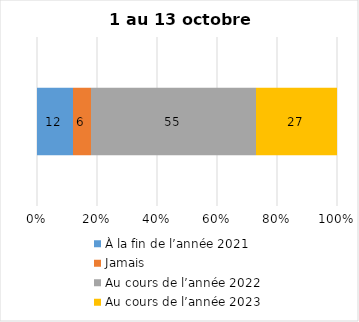
| Category | À la fin de l’année 2021 | Jamais | Au cours de l’année 2022 | Au cours de l’année 2023 |
|---|---|---|---|---|
| 0 | 12 | 6 | 55 | 27 |